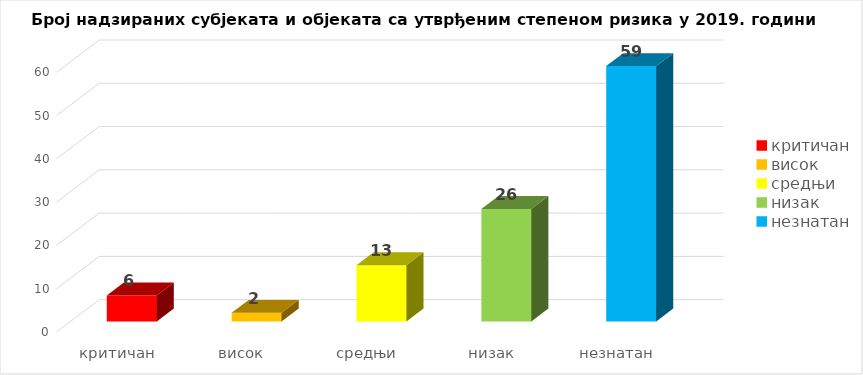
| Category | Series 0 |
|---|---|
| критичан | 6 |
| висок | 2 |
| средњи | 13 |
| низак | 26 |
| незнатан | 59 |